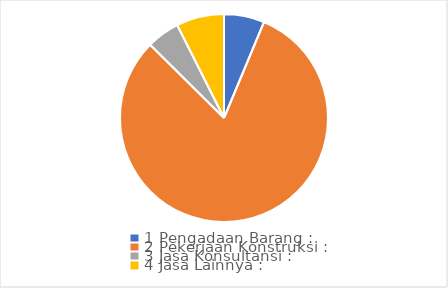
| Category | Series 0 |
|---|---|
| 0 | 11 |
| 1 | 142 |
| 2 | 9 |
| 3 | 13 |